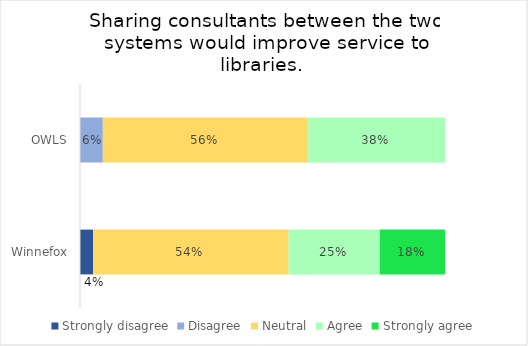
| Category | Strongly disagree | Disagree | Neutral | Agree | Strongly agree |
|---|---|---|---|---|---|
| OWLS | 0 | 0.062 | 0.562 | 0.375 | 0 |
| Winnefox | 0.036 | 0 | 0.536 | 0.25 | 0.179 |